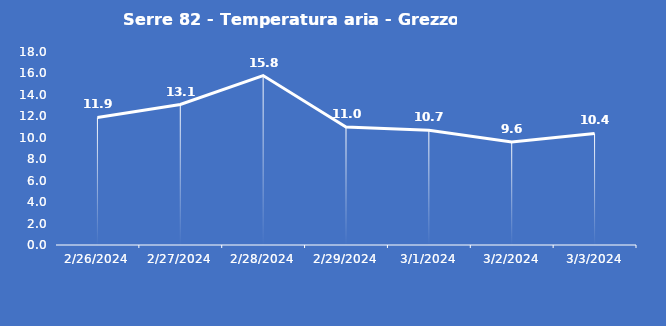
| Category | Serre 82 - Temperatura aria - Grezzo (°C) |
|---|---|
| 2/26/24 | 11.9 |
| 2/27/24 | 13.1 |
| 2/28/24 | 15.8 |
| 2/29/24 | 11 |
| 3/1/24 | 10.7 |
| 3/2/24 | 9.6 |
| 3/3/24 | 10.4 |